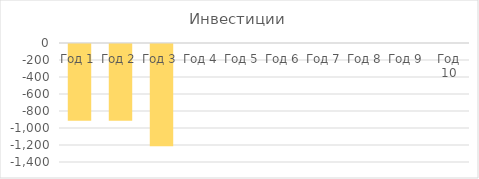
| Category | Инвестиции |
|---|---|
| Год 1 | -903 |
| Год 2 | -903 |
| Год 3 | -1204 |
| Год 4 | 0 |
| Год 5 | 0 |
| Год 6 | 0 |
| Год 7 | 0 |
| Год 8 | 0 |
| Год 9 | 0 |
| Год 10 | 0 |